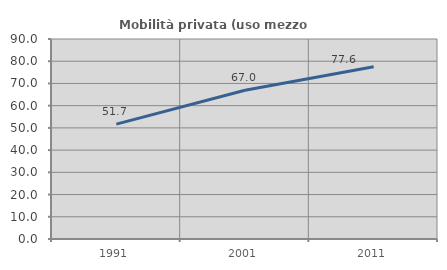
| Category | Mobilità privata (uso mezzo privato) |
|---|---|
| 1991.0 | 51.681 |
| 2001.0 | 66.958 |
| 2011.0 | 77.55 |